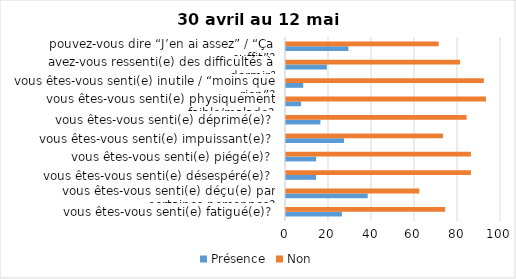
| Category | Présence | Non |
|---|---|---|
| vous êtes-vous senti(e) fatigué(e)? | 26 | 74 |
| vous êtes-vous senti(e) déçu(e) par certaines personnes? | 38 | 62 |
| vous êtes-vous senti(e) désespéré(e)? | 14 | 86 |
| vous êtes-vous senti(e) piégé(e)? | 14 | 86 |
| vous êtes-vous senti(e) impuissant(e)? | 27 | 73 |
| vous êtes-vous senti(e) déprimé(e)? | 16 | 84 |
| vous êtes-vous senti(e) physiquement faible/malade? | 7 | 93 |
| vous êtes-vous senti(e) inutile / “moins que rien”? | 8 | 92 |
| avez-vous ressenti(e) des difficultés à dormir? | 19 | 81 |
| pouvez-vous dire “J’en ai assez” / “Ça suffit”? | 29 | 71 |